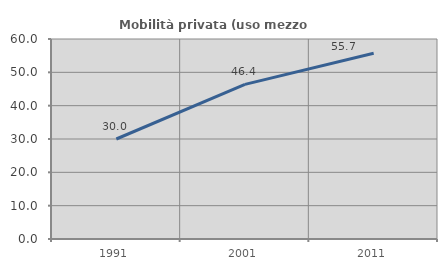
| Category | Mobilità privata (uso mezzo privato) |
|---|---|
| 1991.0 | 30 |
| 2001.0 | 46.389 |
| 2011.0 | 55.7 |